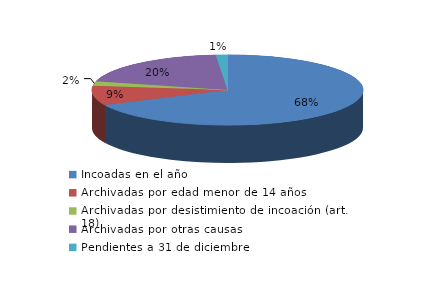
| Category | Series 0 |
|---|---|
| Incoadas en el año | 688 |
| Archivadas por edad menor de 14 años | 92 |
| Archivadas por desistimiento de incoación (art. 18) | 20 |
| Archivadas por otras causas | 199 |
| Pendientes a 31 de diciembre | 14 |